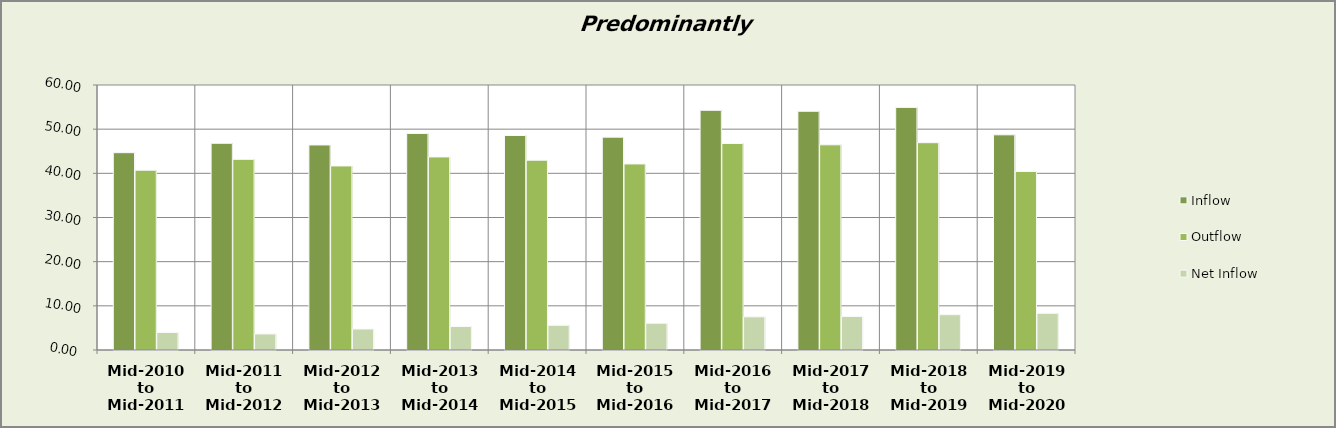
| Category | Inflow | Outflow | Net Inflow |
|---|---|---|---|
| Mid-2010 to Mid-2011 | 44.676 | 40.708 | 3.968 |
| Mid-2011 to Mid-2012 | 46.799 | 43.164 | 3.635 |
| Mid-2012 to Mid-2013 | 46.424 | 41.672 | 4.753 |
| Mid-2013 to Mid-2014 | 49.029 | 43.709 | 5.32 |
| Mid-2014 to Mid-2015 | 48.565 | 42.973 | 5.593 |
| Mid-2015 to Mid-2016 | 48.191 | 42.126 | 6.065 |
| Mid-2016 to Mid-2017 | 54.266 | 46.756 | 7.51 |
| Mid-2017 to Mid-2018 | 54.048 | 46.453 | 7.595 |
| Mid-2018 to Mid-2019 | 54.929 | 46.937 | 7.993 |
| Mid-2019 to Mid-2020 | 48.722 | 40.418 | 8.303 |